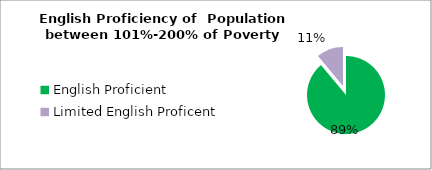
| Category | Percent |
|---|---|
| English Proficient | 0.889 |
| Limited English Proficent | 0.111 |